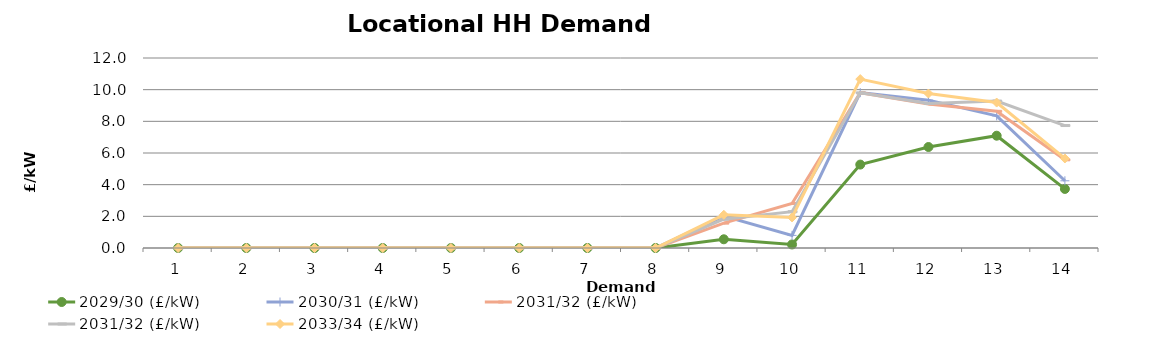
| Category | 2029/30 (£/kW) | 2030/31 (£/kW) | 2031/32 (£/kW) | 2033/34 (£/kW) |
|---|---|---|---|---|
| 1.0 | 0 | 0 | 0 | 0 |
| 2.0 | 0 | 0 | 0 | 0 |
| 3.0 | 0 | 0 | 0 | 0 |
| 4.0 | 0 | 0 | 0 | 0 |
| 5.0 | 0 | 0 | 0 | 0 |
| 6.0 | 0 | 0 | 0 | 0 |
| 7.0 | 0 | 0 | 0 | 0 |
| 8.0 | 0 | 0 | 0 | 0 |
| 9.0 | 0.551 | 2.017 | 1.821 | 2.097 |
| 10.0 | 0.224 | 0.797 | 2.292 | 1.93 |
| 11.0 | 5.268 | 9.812 | 9.798 | 10.667 |
| 12.0 | 6.379 | 9.338 | 9.124 | 9.757 |
| 13.0 | 7.092 | 8.344 | 9.282 | 9.186 |
| 14.0 | 3.73 | 4.245 | 7.734 | 5.655 |